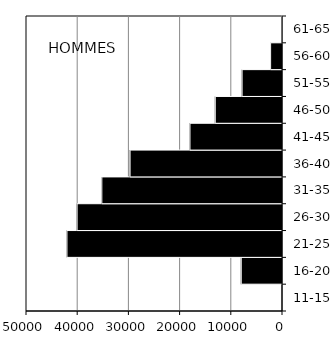
| Category | Hommes |
|---|---|
| 11-15 | 0 |
| 16-20 | -8059 |
| 21-25 | -42098 |
| 26-30 | -40116 |
| 31-35 | -35285 |
| 36-40 | -29772 |
| 41-45 | -18071 |
| 46-50 | -13134 |
| 51-55 | -7894 |
| 56-60 | -2321 |
| 61-65 | -164 |